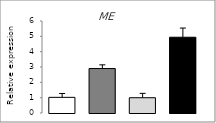
| Category | Series 0 |
|---|---|
| 0 | 1.021 |
| 1 | 2.899 |
| 2 | 0.996 |
| 3 | 4.941 |